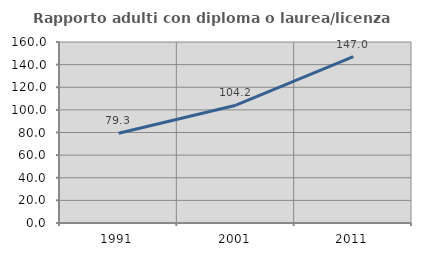
| Category | Rapporto adulti con diploma o laurea/licenza media  |
|---|---|
| 1991.0 | 79.279 |
| 2001.0 | 104.151 |
| 2011.0 | 146.999 |